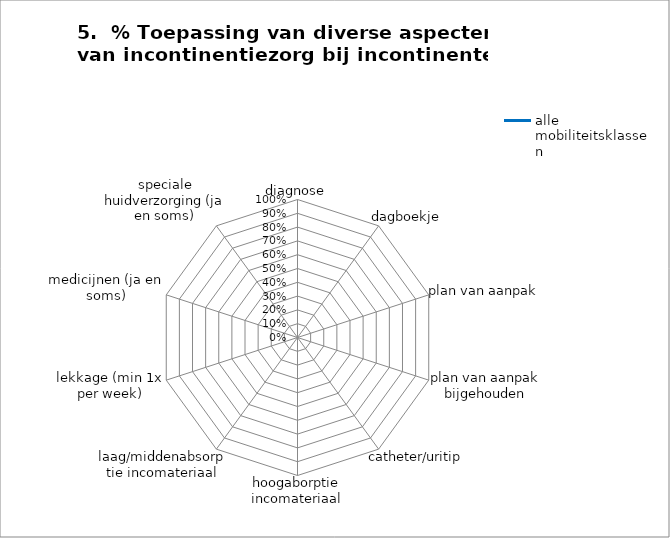
| Category | alle mobiliteitsklassen |
|---|---|
| diagnose | 0 |
| dagboekje | 0 |
| plan van aanpak | 0 |
| plan van aanpak bijgehouden | 0 |
| catheter/uritip | 0 |
| hoogaborptie incomateriaal | 0 |
| laag/middenabsorptie incomateriaal | 0 |
| lekkage (min 1x per week) | 0 |
| medicijnen (ja en soms) | 0 |
| speciale huidverzorging (ja en soms) | 0 |